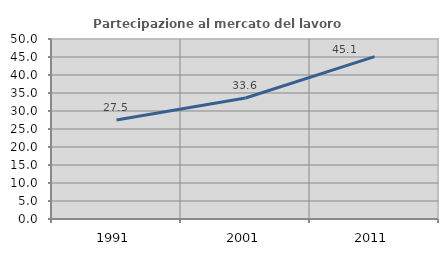
| Category | Partecipazione al mercato del lavoro  femminile |
|---|---|
| 1991.0 | 27.5 |
| 2001.0 | 33.613 |
| 2011.0 | 45.098 |